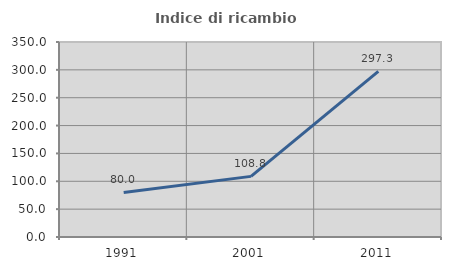
| Category | Indice di ricambio occupazionale  |
|---|---|
| 1991.0 | 80 |
| 2001.0 | 108.8 |
| 2011.0 | 297.333 |